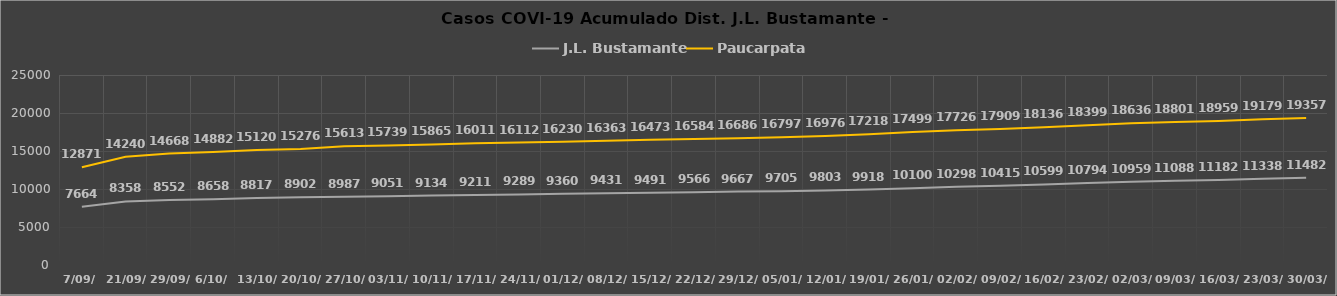
| Category | J.L. Bustamante | Paucarpata |
|---|---|---|
| 7/09/ | 7664 | 12871 |
| 21/09/ | 8358 | 14240 |
| 29/09/ | 8552 | 14668 |
| 6/10/ | 8658 | 14882 |
| 13/10/ | 8817 | 15120 |
| 20/10/ | 8902 | 15276 |
| 27/10/ | 8987 | 15613 |
| 03/11/ | 9051 | 15739 |
| 10/11/ | 9134 | 15865 |
| 17/11/ | 9211 | 16011 |
| 24/11/ | 9289 | 16112 |
| 01/12/ | 9360 | 16230 |
| 08/12/ | 9431 | 16363 |
| 15/12/ | 9491 | 16473 |
| 22/12/ | 9566 | 16584 |
| 29/12/ | 9667 | 16686 |
| 05/01/ | 9705 | 16797 |
| 12/01/ | 9803 | 16976 |
| 19/01/ | 9918 | 17218 |
| 26/01/ | 10100 | 17499 |
| 02/02/ | 10298 | 17726 |
| 09/02/ | 10415 | 17909 |
| 16/02/ | 10599 | 18136 |
| 23/02/ | 10794 | 18399 |
| 02/03/ | 10959 | 18636 |
| 09/03/ | 11088 | 18801 |
| 16/03/ | 11182 | 18959 |
| 23/03/ | 11338 | 19179 |
| 30/03/ | 11482 | 19357 |